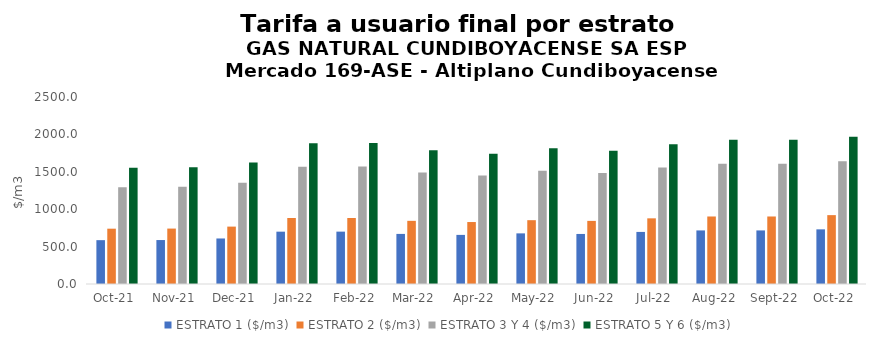
| Category | ESTRATO 1 ($/m3) | ESTRATO 2 ($/m3) | ESTRATO 3 Y 4 ($/m3) | ESTRATO 5 Y 6 ($/m3) |
|---|---|---|---|---|
| 2021-10-01 | 586.17 | 739.47 | 1294.12 | 1552.944 |
| 2021-11-01 | 587.65 | 740.96 | 1300.64 | 1560.768 |
| 2021-12-01 | 608.59 | 767.28 | 1352.49 | 1622.988 |
| 2022-01-01 | 699.65 | 882.45 | 1569.02 | 1882.824 |
| 2022-02-01 | 700.14 | 882.16 | 1571.65 | 1885.98 |
| 2022-03-01 | 669.61 | 844.39 | 1490.39 | 1788.468 |
| 2022-04-01 | 656.53 | 828.5 | 1451.93 | 1742.316 |
| 2022-05-01 | 676.87 | 853.19 | 1513.35 | 1816.02 |
| 2022-06-01 | 669.11 | 843.76 | 1485.4 | 1782.48 |
| 2022-07-01 | 696.25 | 877.82 | 1556.51 | 1867.812 |
| 2022-08-01 | 716.29 | 902.55 | 1608.02 | 1929.624 |
| 2022-09-01 | 716.29 | 902.55 | 1608.02 | 1929.624 |
| 2022-10-01 | 730.59 | 920.71 | 1640.64 | 1968.768 |